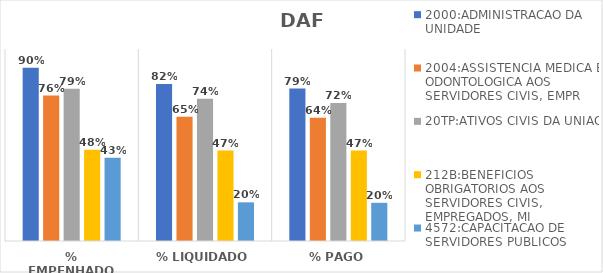
| Category | 2000:ADMINISTRACAO DA UNIDADE | 2004:ASSISTENCIA MEDICA E ODONTOLOGICA AOS SERVIDORES CIVIS, EMPR | 20TP:ATIVOS CIVIS DA UNIAO | 212B:BENEFICIOS OBRIGATORIOS AOS SERVIDORES CIVIS, EMPREGADOS, MI | 4572:CAPACITACAO DE SERVIDORES PUBLICOS FEDERAIS EM PROCESSO DE Q |
|---|---|---|---|---|---|
| % EMPENHADO | 0.902 | 0.758 | 0.793 | 0.476 | 0.434 |
| % LIQUIDADO | 0.818 | 0.647 | 0.741 | 0.471 | 0.201 |
| % PAGO | 0.794 | 0.642 | 0.719 | 0.471 | 0.199 |